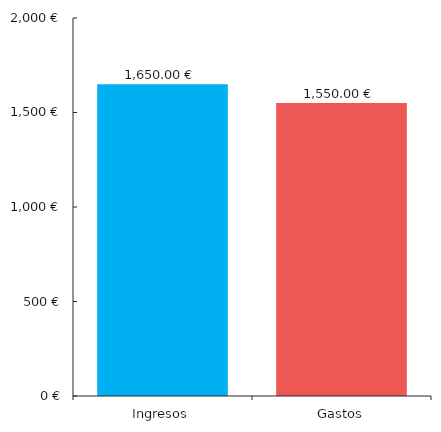
| Category | Data_grafu |
|---|---|
| 0 | 1650 |
| 1 | 1550 |